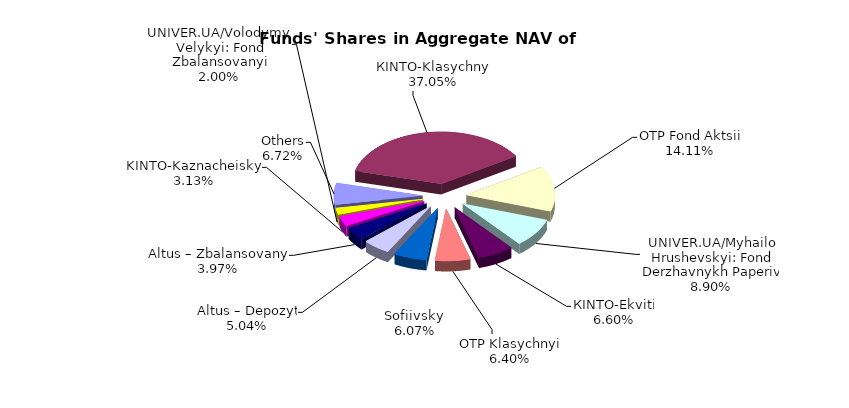
| Category | Series 0 | Series 1 |
|---|---|---|
| Others | 5623617.63 | 0.067 |
| КІNТО-Klasychnyi | 31007375.22 | 0.371 |
| OTP Fond Aktsii | 11806213.37 | 0.141 |
| UNIVER.UA/Myhailo Hrushevskyi: Fond Derzhavnykh Paperiv | 7450535.35 | 0.089 |
| КІNTO-Ekviti | 5524997.43 | 0.066 |
| OTP Klasychnyi' | 5357467.86 | 0.064 |
| Sofiivskyi | 5078275.72 | 0.061 |
| Altus – Depozyt | 4218640.68 | 0.05 |
| Altus – Zbalansovanyi | 3325933.71 | 0.04 |
| KINTO-Kaznacheiskyi | 2616820.26 | 0.031 |
| UNIVER.UA/Volodymyr Velykyi: Fond Zbalansovanyi | 1676603.65 | 0.02 |